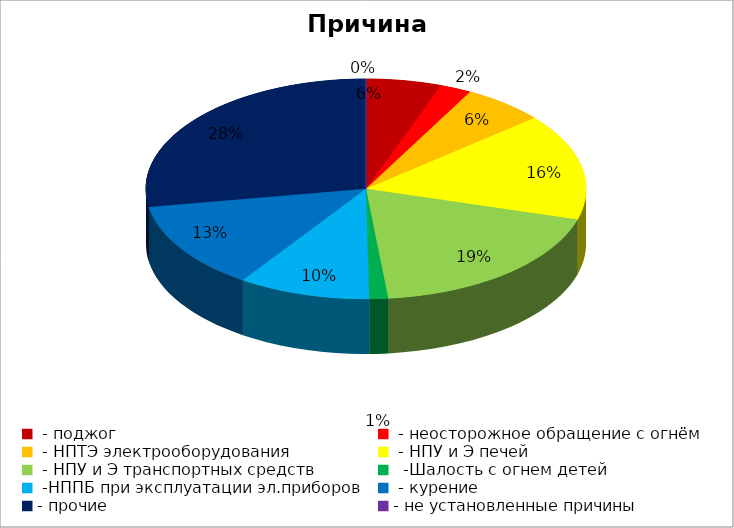
| Category | Причина пожара |
|---|---|
|  - поджог | 12 |
|  - неосторожное обращение с огнём | 5 |
|  - НПТЭ электрооборудования | 13 |
|  - НПУ и Э печей | 34 |
|  - НПУ и Э транспортных средств | 41 |
|   -Шалость с огнем детей | 3 |
|  -НППБ при эксплуатации эл.приборов | 21 |
|  - курение | 28 |
| - прочие | 60 |
| - не установленные причины | 0 |